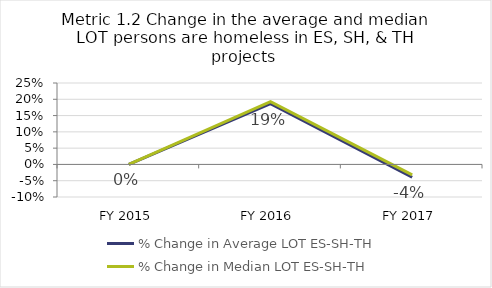
| Category | % Change in Average LOT ES-SH-TH | % Change in Median LOT ES-SH-TH |
|---|---|---|
| FY 2015 | 0 | 0 |
| FY 2016 | 0.187 | 0.193 |
| FY 2017 | -0.039 | -0.032 |